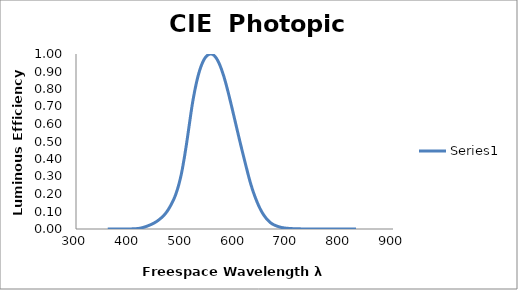
| Category | Series 0 |
|---|---|
| 360.0 | 0 |
| 361.0 | 0 |
| 362.0 | 0 |
| 363.0 | 0 |
| 364.0 | 0 |
| 365.0 | 0 |
| 366.0 | 0 |
| 367.0 | 0 |
| 368.0 | 0 |
| 369.0 | 0 |
| 370.0 | 0 |
| 371.0 | 0 |
| 372.0 | 0 |
| 373.0 | 0 |
| 374.0 | 0 |
| 375.0 | 0 |
| 376.0 | 0 |
| 377.0 | 0 |
| 378.0 | 0 |
| 379.0 | 0 |
| 380.0 | 0 |
| 381.0 | 0 |
| 382.0 | 0 |
| 383.0 | 0 |
| 384.0 | 0 |
| 385.0 | 0 |
| 386.0 | 0 |
| 387.0 | 0 |
| 388.0 | 0 |
| 389.0 | 0 |
| 390.0 | 0 |
| 391.0 | 0 |
| 392.0 | 0 |
| 393.0 | 0 |
| 394.0 | 0 |
| 395.0 | 0 |
| 396.0 | 0 |
| 397.0 | 0 |
| 398.0 | 0 |
| 399.0 | 0 |
| 400.0 | 0 |
| 401.0 | 0 |
| 402.0 | 0 |
| 403.0 | 0.001 |
| 404.0 | 0.001 |
| 405.0 | 0.001 |
| 406.0 | 0.001 |
| 407.0 | 0.001 |
| 408.0 | 0.001 |
| 409.0 | 0.001 |
| 410.0 | 0.001 |
| 411.0 | 0.001 |
| 412.0 | 0.002 |
| 413.0 | 0.002 |
| 414.0 | 0.002 |
| 415.0 | 0.002 |
| 416.0 | 0.002 |
| 417.0 | 0.003 |
| 418.0 | 0.003 |
| 419.0 | 0.004 |
| 420.0 | 0.004 |
| 421.0 | 0.005 |
| 422.0 | 0.005 |
| 423.0 | 0.006 |
| 424.0 | 0.007 |
| 425.0 | 0.007 |
| 426.0 | 0.008 |
| 427.0 | 0.009 |
| 428.0 | 0.01 |
| 429.0 | 0.011 |
| 430.0 | 0.012 |
| 431.0 | 0.013 |
| 432.0 | 0.014 |
| 433.0 | 0.015 |
| 434.0 | 0.016 |
| 435.0 | 0.017 |
| 436.0 | 0.018 |
| 437.0 | 0.019 |
| 438.0 | 0.02 |
| 439.0 | 0.022 |
| 440.0 | 0.023 |
| 441.0 | 0.024 |
| 442.0 | 0.026 |
| 443.0 | 0.027 |
| 444.0 | 0.028 |
| 445.0 | 0.03 |
| 446.0 | 0.031 |
| 447.0 | 0.033 |
| 448.0 | 0.035 |
| 449.0 | 0.036 |
| 450.0 | 0.038 |
| 451.0 | 0.04 |
| 452.0 | 0.042 |
| 453.0 | 0.044 |
| 454.0 | 0.046 |
| 455.0 | 0.048 |
| 456.0 | 0.05 |
| 457.0 | 0.053 |
| 458.0 | 0.055 |
| 459.0 | 0.057 |
| 460.0 | 0.06 |
| 461.0 | 0.063 |
| 462.0 | 0.065 |
| 463.0 | 0.068 |
| 464.0 | 0.071 |
| 465.0 | 0.074 |
| 466.0 | 0.077 |
| 467.0 | 0.08 |
| 468.0 | 0.084 |
| 469.0 | 0.087 |
| 470.0 | 0.091 |
| 471.0 | 0.095 |
| 472.0 | 0.099 |
| 473.0 | 0.103 |
| 474.0 | 0.108 |
| 475.0 | 0.113 |
| 476.0 | 0.118 |
| 477.0 | 0.123 |
| 478.0 | 0.128 |
| 479.0 | 0.133 |
| 480.0 | 0.139 |
| 481.0 | 0.145 |
| 482.0 | 0.15 |
| 483.0 | 0.156 |
| 484.0 | 0.163 |
| 485.0 | 0.169 |
| 486.0 | 0.176 |
| 487.0 | 0.184 |
| 488.0 | 0.191 |
| 489.0 | 0.199 |
| 490.0 | 0.208 |
| 491.0 | 0.217 |
| 492.0 | 0.227 |
| 493.0 | 0.237 |
| 494.0 | 0.247 |
| 495.0 | 0.259 |
| 496.0 | 0.27 |
| 497.0 | 0.282 |
| 498.0 | 0.295 |
| 499.0 | 0.309 |
| 500.0 | 0.323 |
| 501.0 | 0.338 |
| 502.0 | 0.355 |
| 503.0 | 0.372 |
| 504.0 | 0.389 |
| 505.0 | 0.407 |
| 506.0 | 0.426 |
| 507.0 | 0.444 |
| 508.0 | 0.463 |
| 509.0 | 0.483 |
| 510.0 | 0.503 |
| 511.0 | 0.524 |
| 512.0 | 0.545 |
| 513.0 | 0.566 |
| 514.0 | 0.587 |
| 515.0 | 0.608 |
| 516.0 | 0.629 |
| 517.0 | 0.65 |
| 518.0 | 0.671 |
| 519.0 | 0.691 |
| 520.0 | 0.71 |
| 521.0 | 0.728 |
| 522.0 | 0.745 |
| 523.0 | 0.762 |
| 524.0 | 0.778 |
| 525.0 | 0.793 |
| 526.0 | 0.808 |
| 527.0 | 0.822 |
| 528.0 | 0.836 |
| 529.0 | 0.849 |
| 530.0 | 0.862 |
| 531.0 | 0.874 |
| 532.0 | 0.885 |
| 533.0 | 0.895 |
| 534.0 | 0.905 |
| 535.0 | 0.915 |
| 536.0 | 0.924 |
| 537.0 | 0.932 |
| 538.0 | 0.94 |
| 539.0 | 0.947 |
| 540.0 | 0.954 |
| 541.0 | 0.96 |
| 542.0 | 0.966 |
| 543.0 | 0.971 |
| 544.0 | 0.976 |
| 545.0 | 0.98 |
| 546.0 | 0.984 |
| 547.0 | 0.987 |
| 548.0 | 0.99 |
| 549.0 | 0.993 |
| 550.0 | 0.995 |
| 551.0 | 0.997 |
| 552.0 | 0.998 |
| 553.0 | 0.999 |
| 554.0 | 1 |
| 555.0 | 1 |
| 556.0 | 1 |
| 557.0 | 0.999 |
| 558.0 | 0.998 |
| 559.0 | 0.997 |
| 560.0 | 0.995 |
| 561.0 | 0.993 |
| 562.0 | 0.99 |
| 563.0 | 0.986 |
| 564.0 | 0.983 |
| 565.0 | 0.979 |
| 566.0 | 0.974 |
| 567.0 | 0.969 |
| 568.0 | 0.964 |
| 569.0 | 0.958 |
| 570.0 | 0.952 |
| 571.0 | 0.945 |
| 572.0 | 0.938 |
| 573.0 | 0.931 |
| 574.0 | 0.923 |
| 575.0 | 0.915 |
| 576.0 | 0.907 |
| 577.0 | 0.898 |
| 578.0 | 0.889 |
| 579.0 | 0.88 |
| 580.0 | 0.87 |
| 581.0 | 0.86 |
| 582.0 | 0.849 |
| 583.0 | 0.839 |
| 584.0 | 0.828 |
| 585.0 | 0.816 |
| 586.0 | 0.805 |
| 587.0 | 0.793 |
| 588.0 | 0.781 |
| 589.0 | 0.769 |
| 590.0 | 0.757 |
| 591.0 | 0.745 |
| 592.0 | 0.732 |
| 593.0 | 0.72 |
| 594.0 | 0.707 |
| 595.0 | 0.695 |
| 596.0 | 0.682 |
| 597.0 | 0.669 |
| 598.0 | 0.657 |
| 599.0 | 0.644 |
| 600.0 | 0.631 |
| 601.0 | 0.618 |
| 602.0 | 0.605 |
| 603.0 | 0.592 |
| 604.0 | 0.58 |
| 605.0 | 0.567 |
| 606.0 | 0.554 |
| 607.0 | 0.541 |
| 608.0 | 0.528 |
| 609.0 | 0.516 |
| 610.0 | 0.503 |
| 611.0 | 0.49 |
| 612.0 | 0.478 |
| 613.0 | 0.466 |
| 614.0 | 0.453 |
| 615.0 | 0.441 |
| 616.0 | 0.429 |
| 617.0 | 0.417 |
| 618.0 | 0.405 |
| 619.0 | 0.393 |
| 620.0 | 0.381 |
| 621.0 | 0.369 |
| 622.0 | 0.357 |
| 623.0 | 0.345 |
| 624.0 | 0.333 |
| 625.0 | 0.321 |
| 626.0 | 0.309 |
| 627.0 | 0.298 |
| 628.0 | 0.287 |
| 629.0 | 0.276 |
| 630.0 | 0.265 |
| 631.0 | 0.255 |
| 632.0 | 0.245 |
| 633.0 | 0.235 |
| 634.0 | 0.226 |
| 635.0 | 0.217 |
| 636.0 | 0.208 |
| 637.0 | 0.2 |
| 638.0 | 0.191 |
| 639.0 | 0.183 |
| 640.0 | 0.175 |
| 641.0 | 0.167 |
| 642.0 | 0.16 |
| 643.0 | 0.152 |
| 644.0 | 0.145 |
| 645.0 | 0.138 |
| 646.0 | 0.132 |
| 647.0 | 0.125 |
| 648.0 | 0.119 |
| 649.0 | 0.113 |
| 650.0 | 0.107 |
| 651.0 | 0.101 |
| 652.0 | 0.096 |
| 653.0 | 0.091 |
| 654.0 | 0.086 |
| 655.0 | 0.082 |
| 656.0 | 0.077 |
| 657.0 | 0.073 |
| 658.0 | 0.069 |
| 659.0 | 0.065 |
| 660.0 | 0.061 |
| 661.0 | 0.057 |
| 662.0 | 0.054 |
| 663.0 | 0.051 |
| 664.0 | 0.048 |
| 665.0 | 0.045 |
| 666.0 | 0.042 |
| 667.0 | 0.039 |
| 668.0 | 0.037 |
| 669.0 | 0.034 |
| 670.0 | 0.032 |
| 671.0 | 0.03 |
| 672.0 | 0.028 |
| 673.0 | 0.026 |
| 674.0 | 0.025 |
| 675.0 | 0.023 |
| 676.0 | 0.022 |
| 677.0 | 0.021 |
| 678.0 | 0.019 |
| 679.0 | 0.018 |
| 680.0 | 0.017 |
| 681.0 | 0.016 |
| 682.0 | 0.015 |
| 683.0 | 0.014 |
| 684.0 | 0.013 |
| 685.0 | 0.012 |
| 686.0 | 0.011 |
| 687.0 | 0.01 |
| 688.0 | 0.01 |
| 689.0 | 0.009 |
| 690.0 | 0.008 |
| 691.0 | 0.008 |
| 692.0 | 0.007 |
| 693.0 | 0.007 |
| 694.0 | 0.006 |
| 695.0 | 0.006 |
| 696.0 | 0.005 |
| 697.0 | 0.005 |
| 698.0 | 0.005 |
| 699.0 | 0.004 |
| 700.0 | 0.004 |
| 701.0 | 0.004 |
| 702.0 | 0.004 |
| 703.0 | 0.003 |
| 704.0 | 0.003 |
| 705.0 | 0.003 |
| 706.0 | 0.003 |
| 707.0 | 0.003 |
| 708.0 | 0.002 |
| 709.0 | 0.002 |
| 710.0 | 0.002 |
| 711.0 | 0.002 |
| 712.0 | 0.002 |
| 713.0 | 0.002 |
| 714.0 | 0.002 |
| 715.0 | 0.001 |
| 716.0 | 0.001 |
| 717.0 | 0.001 |
| 718.0 | 0.001 |
| 719.0 | 0.001 |
| 720.0 | 0.001 |
| 721.0 | 0.001 |
| 722.0 | 0.001 |
| 723.0 | 0.001 |
| 724.0 | 0.001 |
| 725.0 | 0.001 |
| 726.0 | 0.001 |
| 727.0 | 0.001 |
| 728.0 | 0.001 |
| 729.0 | 0.001 |
| 730.0 | 0.001 |
| 731.0 | 0 |
| 732.0 | 0 |
| 733.0 | 0 |
| 734.0 | 0 |
| 735.0 | 0 |
| 736.0 | 0 |
| 737.0 | 0 |
| 738.0 | 0 |
| 739.0 | 0 |
| 740.0 | 0 |
| 741.0 | 0 |
| 742.0 | 0 |
| 743.0 | 0 |
| 744.0 | 0 |
| 745.0 | 0 |
| 746.0 | 0 |
| 747.0 | 0 |
| 748.0 | 0 |
| 749.0 | 0 |
| 750.0 | 0 |
| 751.0 | 0 |
| 752.0 | 0 |
| 753.0 | 0 |
| 754.0 | 0 |
| 755.0 | 0 |
| 756.0 | 0 |
| 757.0 | 0 |
| 758.0 | 0 |
| 759.0 | 0 |
| 760.0 | 0 |
| 761.0 | 0 |
| 762.0 | 0 |
| 763.0 | 0 |
| 764.0 | 0 |
| 765.0 | 0 |
| 766.0 | 0 |
| 767.0 | 0 |
| 768.0 | 0 |
| 769.0 | 0 |
| 770.0 | 0 |
| 771.0 | 0 |
| 772.0 | 0 |
| 773.0 | 0 |
| 774.0 | 0 |
| 775.0 | 0 |
| 776.0 | 0 |
| 777.0 | 0 |
| 778.0 | 0 |
| 779.0 | 0 |
| 780.0 | 0 |
| 781.0 | 0 |
| 782.0 | 0 |
| 783.0 | 0 |
| 784.0 | 0 |
| 785.0 | 0 |
| 786.0 | 0 |
| 787.0 | 0 |
| 788.0 | 0 |
| 789.0 | 0 |
| 790.0 | 0 |
| 791.0 | 0 |
| 792.0 | 0 |
| 793.0 | 0 |
| 794.0 | 0 |
| 795.0 | 0 |
| 796.0 | 0 |
| 797.0 | 0 |
| 798.0 | 0 |
| 799.0 | 0 |
| 800.0 | 0 |
| 801.0 | 0 |
| 802.0 | 0 |
| 803.0 | 0 |
| 804.0 | 0 |
| 805.0 | 0 |
| 806.0 | 0 |
| 807.0 | 0 |
| 808.0 | 0 |
| 809.0 | 0 |
| 810.0 | 0 |
| 811.0 | 0 |
| 812.0 | 0 |
| 813.0 | 0 |
| 814.0 | 0 |
| 815.0 | 0 |
| 816.0 | 0 |
| 817.0 | 0 |
| 818.0 | 0 |
| 819.0 | 0 |
| 820.0 | 0 |
| 821.0 | 0 |
| 822.0 | 0 |
| 823.0 | 0 |
| 824.0 | 0 |
| 825.0 | 0 |
| 826.0 | 0 |
| 827.0 | 0 |
| 828.0 | 0 |
| 829.0 | 0 |
| 830.0 | 0 |